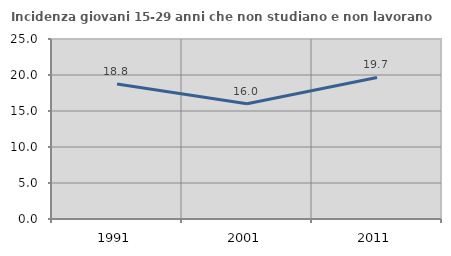
| Category | Incidenza giovani 15-29 anni che non studiano e non lavorano  |
|---|---|
| 1991.0 | 18.75 |
| 2001.0 | 16 |
| 2011.0 | 19.653 |